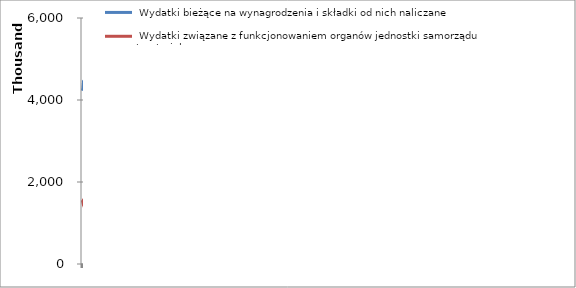
| Category |  Wydatki bieżące na wynagrodzenia i składki od nich naliczane |  Wydatki związane z funkcjonowaniem organów jednostki samorządu terytorialnego |
|---|---|---|
| 2014.0 | 4226255 | 1555803 |
| 2015.0 | 4271290 | 1509400 |
| 2016.0 | 4378000 | 1547135 |
| 2017.0 | 4487450 | 1585800 |